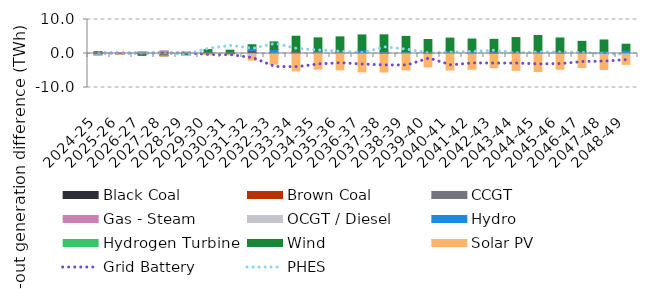
| Category | Black Coal | Brown Coal | CCGT | Gas - Steam | OCGT / Diesel | Hydro | Hydrogen Turbine | Wind | Solar PV |
|---|---|---|---|---|---|---|---|---|---|
| 2024-25 | -0.134 | 0.431 | -0.215 | 0 | -0.011 | -0.07 | 0 | 0.066 | -0.019 |
| 2025-26 | 0.017 | 0.261 | -0.138 | 0.01 | -0.012 | -0.057 | 0 | -0.079 | -0.01 |
| 2026-27 | 0.009 | 0.321 | -0.331 | 0.072 | -0.009 | 0.015 | 0 | -0.214 | 0.032 |
| 2027-28 | 0.395 | 0.206 | -0.598 | 0.172 | -0.027 | 0 | 0 | -0.099 | -0.027 |
| 2028-29 | 0.123 | 0.096 | -0.227 | 0.219 | 0.011 | -0.078 | 0 | -0.257 | -0.005 |
| 2029-30 | 0.142 | -0.009 | -0.081 | 0.075 | -0.045 | 0.038 | 0 | 0.903 | -0.222 |
| 2030-31 | 0.016 | 0.001 | -0.258 | -0.007 | -0.094 | 0.054 | 0 | 0.91 | -0.02 |
| 2031-32 | 0.486 | 0.334 | 0.094 | 0.004 | -0.614 | 0.576 | 0 | 1.081 | -1.367 |
| 2032-33 | 0.32 | -0.04 | -0.042 | 0.007 | -0.24 | 0.886 | 0 | 2.197 | -2.826 |
| 2033-34 | 0.431 | 0 | 0.193 | -0.024 | -0.061 | -0.029 | 0 | 4.458 | -5.002 |
| 2034-35 | 0.132 | 0 | 0.322 | 0.103 | -0.108 | 0.252 | 0 | 3.792 | -4.504 |
| 2035-36 | 0.164 | 0 | 0.264 | 0.022 | -0.259 | 0.314 | 0 | 4.14 | -4.546 |
| 2036-37 | 0.053 | 0 | 0.137 | 0.059 | -0.117 | 0.78 | 0 | 4.435 | -5.303 |
| 2037-38 | 0 | 0 | -0.017 | -0.016 | -0.197 | 0.512 | 0 | 4.987 | -5.224 |
| 2038-39 | 0 | 0 | 0.23 | 0.014 | -0.305 | 0.283 | 0 | 4.511 | -4.515 |
| 2039-40 | 0 | 0 | 0.044 | 0 | -0.355 | 0.282 | 0 | 3.786 | -3.605 |
| 2040-41 | 0 | 0 | 0.343 | 0 | -0.065 | 0.468 | 0 | 3.724 | -4.799 |
| 2041-42 | 0 | 0 | 0.111 | 0 | -0.358 | 0.583 | 0 | 3.558 | -4.279 |
| 2042-43 | 0 | 0 | -0.044 | 0 | -0.205 | 0.558 | 0 | 3.611 | -3.937 |
| 2043-44 | 0 | 0 | 0.119 | 0 | -0.156 | 0.314 | 0 | 4.255 | -4.803 |
| 2044-45 | 0 | 0 | 0.116 | 0 | -0.297 | 0.475 | 0 | 4.702 | -5.012 |
| 2045-46 | 0 | 0 | 0.023 | 0 | -0.216 | 0.603 | 0 | 3.947 | -4.429 |
| 2046-47 | 0 | 0 | 0.011 | 0 | -0.121 | 0.613 | 0 | 2.951 | -4.009 |
| 2047-48 | 0 | 0 | 0 | 0 | -0.364 | 0.793 | 0 | 3.187 | -4.362 |
| 2048-49 | 0 | 0 | 0.015 | 0 | 0.142 | 0.828 | 0 | 1.757 | -3.182 |